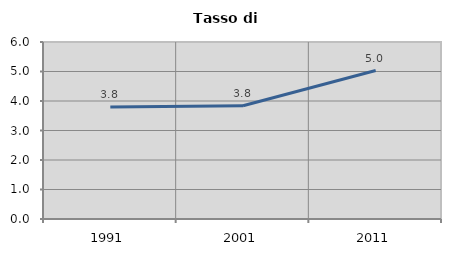
| Category | Tasso di disoccupazione   |
|---|---|
| 1991.0 | 3.795 |
| 2001.0 | 3.84 |
| 2011.0 | 5.034 |